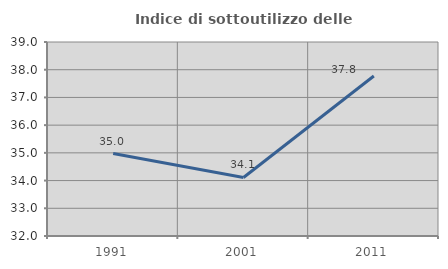
| Category | Indice di sottoutilizzo delle abitazioni  |
|---|---|
| 1991.0 | 34.974 |
| 2001.0 | 34.112 |
| 2011.0 | 37.773 |